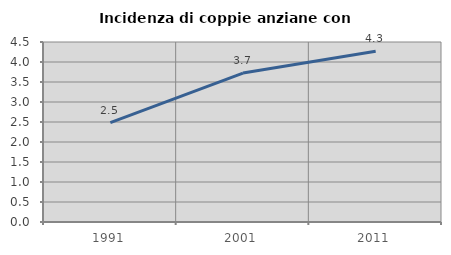
| Category | Incidenza di coppie anziane con figli |
|---|---|
| 1991.0 | 2.485 |
| 2001.0 | 3.723 |
| 2011.0 | 4.271 |